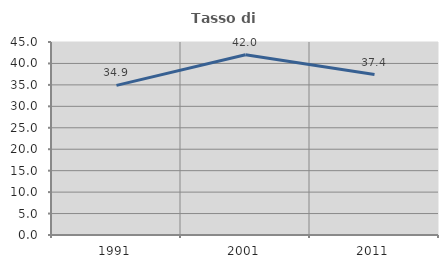
| Category | Tasso di occupazione   |
|---|---|
| 1991.0 | 34.884 |
| 2001.0 | 42.038 |
| 2011.0 | 37.398 |